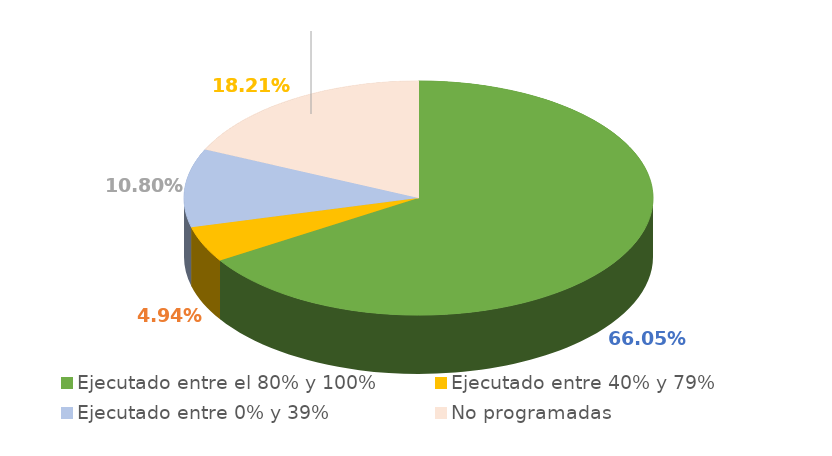
| Category | Series 0 |
|---|---|
| Ejecutado entre el 80% y 100% | 0.66 |
| Ejecutado entre 40% y 79% | 0.049 |
| Ejecutado entre 0% y 39% | 0.108 |
| No programadas | 0.182 |